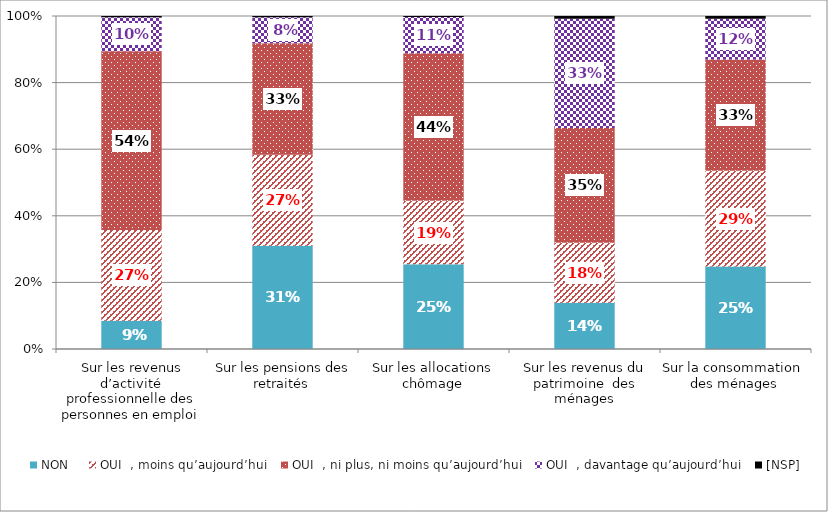
| Category | NON | OUI  , moins qu’aujourd’hui | OUI  , ni plus, ni moins qu’aujourd’hui | OUI  , davantage qu’aujourd’hui | [NSP] |
|---|---|---|---|---|---|
|  Sur les revenus d’activité professionnelle des personnes en emploi | 0.085 | 0.272 | 0.537 | 0.102 | 0.004 |
| Sur les pensions des retraités  | 0.31 | 0.273 | 0.334 | 0.078 | 0.004 |
| Sur les allocations chômage | 0.254 | 0.191 | 0.442 | 0.109 | 0.003 |
| Sur les revenus du patrimoine  des ménages | 0.139 | 0.18 | 0.345 | 0.328 | 0.008 |
| Sur la consommation  des ménages | 0.248 | 0.287 | 0.334 | 0.123 | 0.008 |